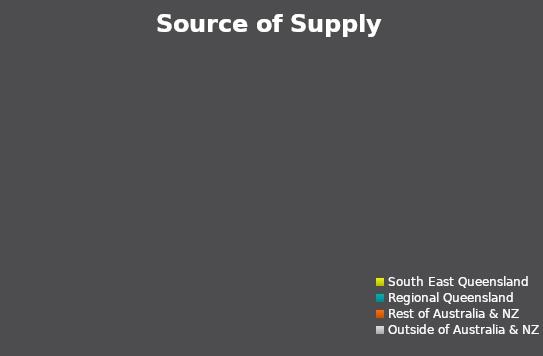
| Category | Series 0 | Series 1 |
|---|---|---|
| South East Queensland | 0 |  |
| Regional Queensland | 0 |  |
| Rest of Australia & NZ | 0 |  |
| Outside of Australia & NZ | 0 |  |